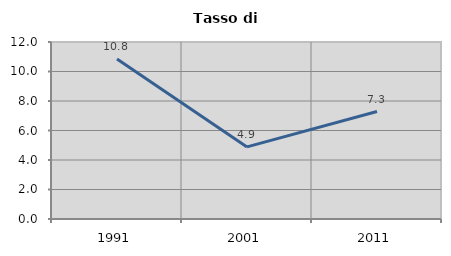
| Category | Tasso di disoccupazione   |
|---|---|
| 1991.0 | 10.847 |
| 2001.0 | 4.887 |
| 2011.0 | 7.284 |